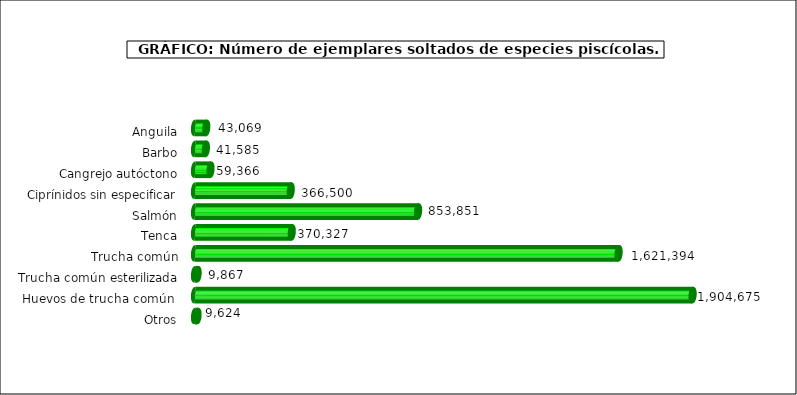
| Category | Series 1 |
|---|---|
| Anguila | 43069 |
| Barbo | 41585 |
| Cangrejo autóctono | 59366 |
| Ciprínidos sin especificar | 366500 |
| Salmón | 853851 |
| Tenca | 370327 |
| Trucha común | 1621394 |
| Trucha común esterilizada | 9867 |
| Huevos de trucha común  | 1904675 |
| Otros | 9624 |